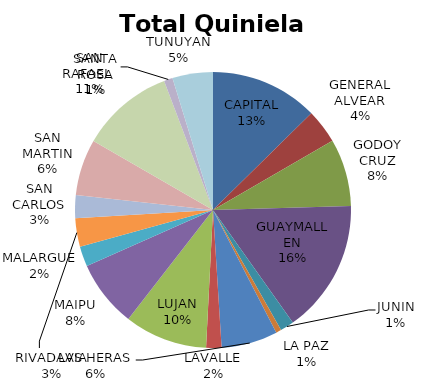
| Category | Total Quiniela Beneficio |
|---|---|
| CAPITAL | 3384667.33 |
| GENERAL ALVEAR | 1077998.44 |
| GODOY CRUZ | 2118027.29 |
| GUAYMALLEN | 4196714.53 |
| JUNIN | 432173.61 |
| LA PAZ | 165530.24 |
| LAS HERAS | 1766450.42 |
| LAVALLE | 482698.38 |
| LUJAN | 2603682.08 |
| MAIPU | 2104312.2 |
| MALARGUE | 634012.85 |
| RIVADAVIA | 888579.47 |
| SAN CARLOS | 727120.28 |
| SAN MARTIN | 1764832.27 |
| SAN RAFAEL  | 2925471.66 |
| SANTA ROSA | 272359.95 |
| TUNUYAN | 1273309.14 |